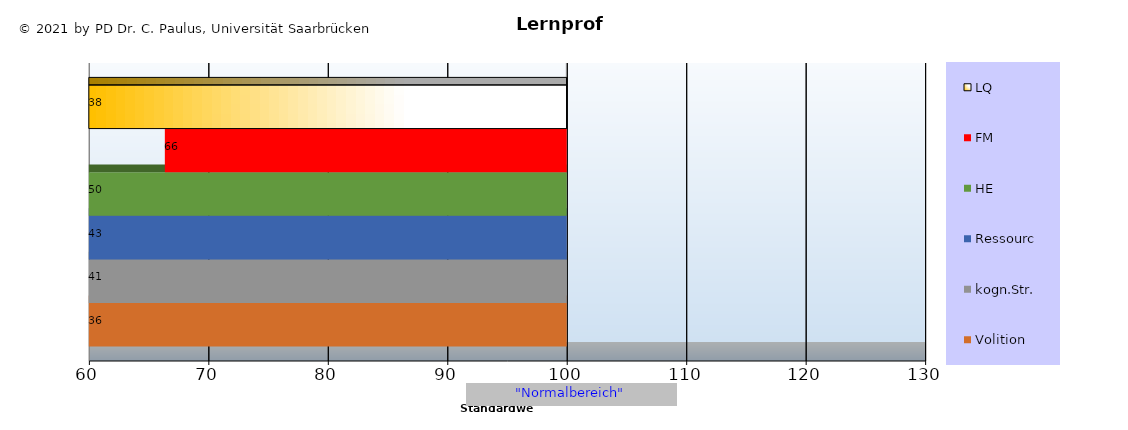
| Category | Volition | kogn.Str. | Ressourc | HE | FM | LQ |
|---|---|---|---|---|---|---|
| 40.909550162982136 | 35.967 | 40.91 | 43.013 | 50.462 | 66.361 | 37.518 |